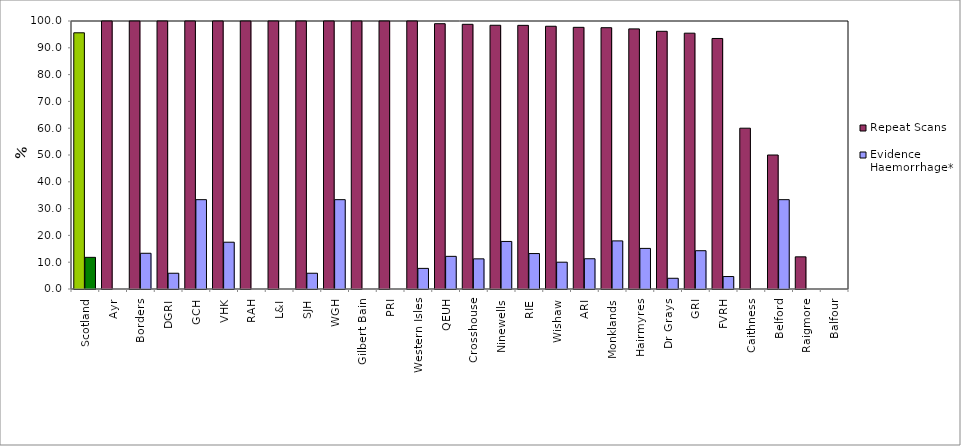
| Category | Repeat Scans | Evidence Haemorrhage* |
|---|---|---|
| Scotland | 95.598 | 11.812 |
| Ayr | 100 | 0 |
| Borders | 100 | 13.333 |
| DGRI | 100 | 5.882 |
| GCH | 100 | 33.333 |
| VHK | 100 | 17.46 |
| RAH | 100 | 0 |
| L&I | 100 | 0 |
| SJH | 100 | 5.882 |
| WGH | 100 | 33.333 |
| Gilbert Bain | 100 | 0 |
| PRI | 100 | 0 |
| Western Isles | 100 | 7.692 |
| QEUH | 98.995 | 12.183 |
| Crosshouse | 98.765 | 11.25 |
| Ninewells | 98.413 | 17.742 |
| RIE | 98.374 | 13.223 |
| Wishaw | 98.039 | 10 |
| ARI | 97.638 | 11.29 |
| Monklands | 97.5 | 17.949 |
| Hairmyres | 97.059 | 15.152 |
| Dr Grays | 96.154 | 4 |
| GRI | 95.455 | 14.286 |
| FVRH | 93.478 | 4.651 |
| Caithness | 60 | 0 |
| Belford | 50 | 33.333 |
| Raigmore | 12 | 0 |
| Balfour | 0 | 0 |